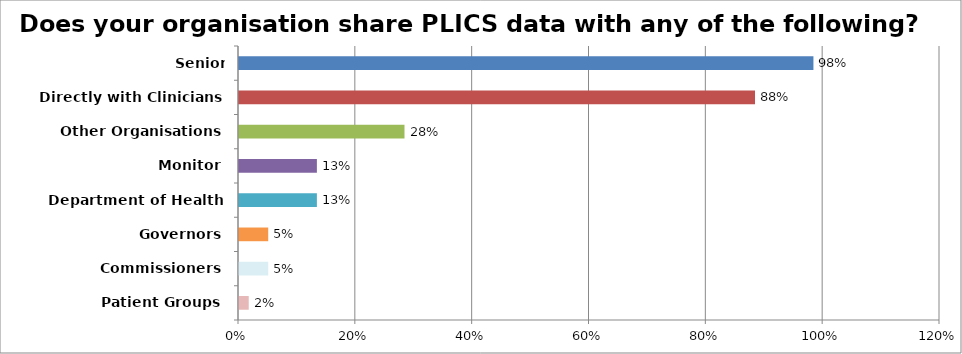
| Category | Percentage |
|---|---|
| Patient Groups | 0.017 |
| Commissioners | 0.05 |
| Governors | 0.05 |
| Department of Health | 0.133 |
| Monitor | 0.133 |
| Other Organisations | 0.283 |
| Directly with Clinicians | 0.883 |
| Senior management/directors | 0.983 |